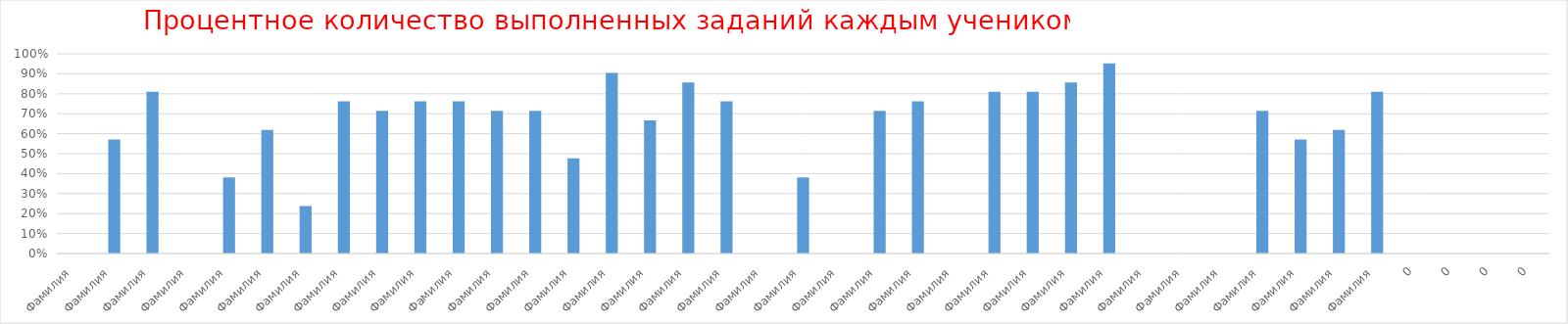
| Category | Series 0 |
|---|---|
| Фамилия  | 0 |
| Фамилия  | 0.571 |
| Фамилия  | 0.81 |
| Фамилия  | 0 |
| Фамилия  | 0.381 |
| Фамилия  | 0.619 |
| Фамилия  | 0.238 |
| Фамилия  | 0.762 |
| Фамилия  | 0.714 |
| Фамилия  | 0.762 |
| Фамилия  | 0.762 |
| Фамилия  | 0.714 |
| Фамилия  | 0.714 |
| Фамилия  | 0.476 |
| Фамилия  | 0.905 |
| Фамилия  | 0.667 |
| Фамилия  | 0.857 |
| Фамилия  | 0.762 |
| Фамилия  | 0 |
| Фамилия  | 0.381 |
| Фамилия  | 0 |
| Фамилия  | 0.714 |
| Фамилия  | 0.762 |
| Фамилия  | 0 |
| Фамилия  | 0.81 |
| Фамилия  | 0.81 |
| Фамилия  | 0.857 |
| Фамилия  | 0.952 |
| Фамилия  | 0 |
| Фамилия  | 0 |
| Фамилия  | 0 |
| Фамилия  | 0.714 |
| Фамилия  | 0.571 |
| Фамилия  | 0.619 |
| Фамилия  | 0.81 |
| 0 | 0 |
| 0 | 0 |
| 0 | 0 |
| 0 | 0 |